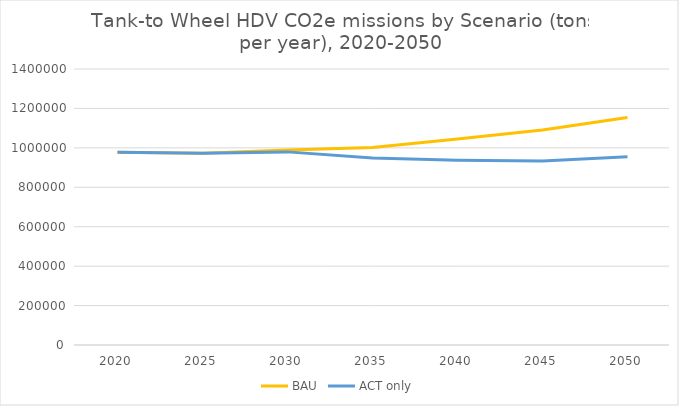
| Category | BAU | ACT only |
|---|---|---|
| 2020.0 | 978101.143 | 978101.143 |
| 2025.0 | 972578.691 | 972578.691 |
| 2030.0 | 989485.839 | 979600.812 |
| 2035.0 | 1001598.013 | 948560.535 |
| 2040.0 | 1044384.186 | 937357.898 |
| 2045.0 | 1090233.107 | 933694.121 |
| 2050.0 | 1153785.594 | 954757.646 |